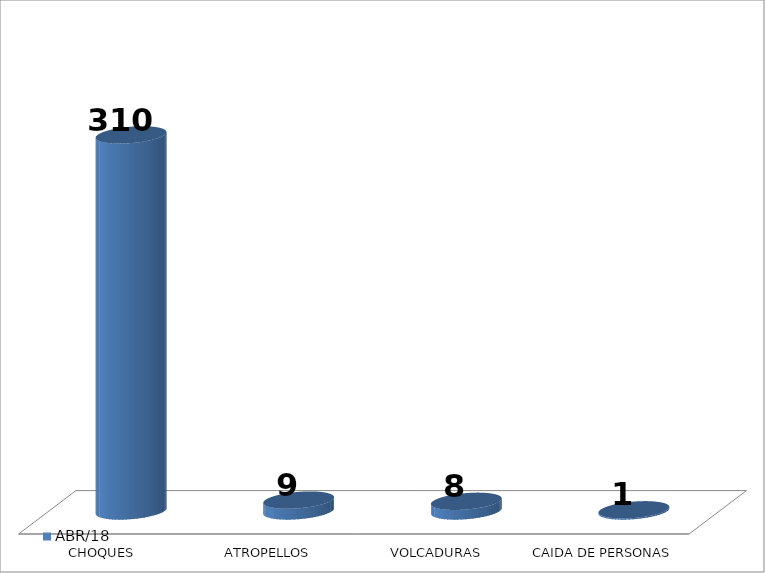
| Category | ABR/18 |
|---|---|
| CHOQUES | 310 |
| ATROPELLOS | 9 |
| VOLCADURAS | 8 |
| CAIDA DE PERSONAS | 1 |